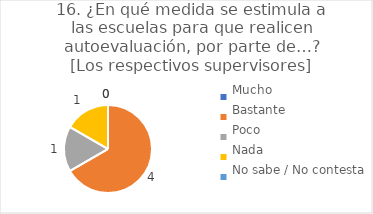
| Category | 16. ¿En qué medida se estimula a las escuelas para que realicen autoevaluación, por parte de…?
[Los respectivos supervisores] |
|---|---|
| Mucho  | 0 |
| Bastante  | 0.667 |
| Poco  | 0.167 |
| Nada  | 0.167 |
| No sabe / No contesta | 0 |